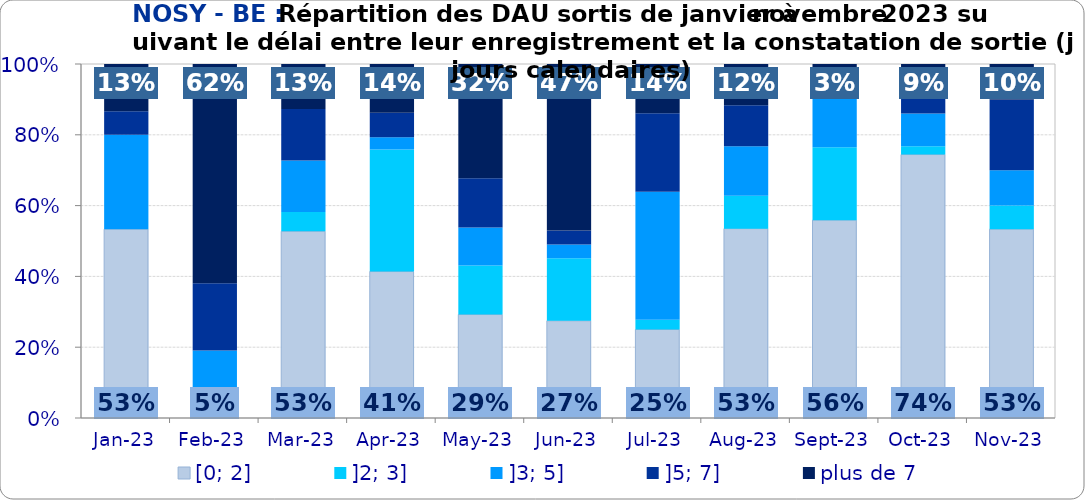
| Category | [0; 2] | ]2; 3] | ]3; 5] | ]5; 7] | plus de 7 |
|---|---|---|---|---|---|
| 2023-01-01 | 0.533 | 0 | 0.267 | 0.067 | 0.133 |
| 2023-02-01 | 0.048 | 0 | 0.143 | 0.19 | 0.619 |
| 2023-03-01 | 0.527 | 0.055 | 0.145 | 0.145 | 0.127 |
| 2023-04-01 | 0.414 | 0.345 | 0.034 | 0.069 | 0.138 |
| 2023-05-01 | 0.292 | 0.138 | 0.108 | 0.138 | 0.323 |
| 2023-06-01 | 0.275 | 0.176 | 0.039 | 0.039 | 0.471 |
| 2023-07-01 | 0.25 | 0.028 | 0.361 | 0.222 | 0.139 |
| 2023-08-01 | 0.535 | 0.093 | 0.14 | 0.116 | 0.116 |
| 2023-09-01 | 0.559 | 0.206 | 0.176 | 0.029 | 0.029 |
| 2023-10-01 | 0.744 | 0.023 | 0.093 | 0.047 | 0.093 |
| 2023-11-01 | 0.533 | 0.067 | 0.1 | 0.2 | 0.1 |